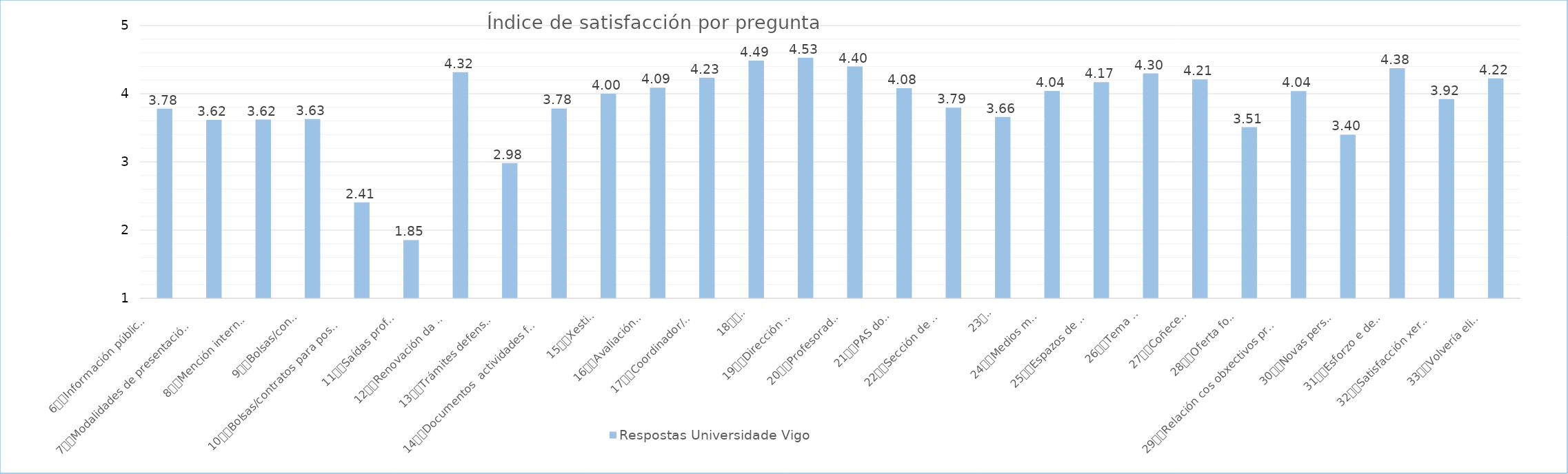
| Category | Respostas Universidade Vigo |
|---|---|
| 6
Información pública DO pd | 3.781 |
| 7
Modalidades de presentación da tese | 3.616 |
| 8
Mención internacional | 3.62 |
| 9
Bolsas/contratos | 3.63 |
| 10
Bolsas/contratos para postdoutorais | 2.405 |
| 11
Saídas profesionais | 1.854 |
| 12
Renovación da matrícula | 4.316 |
| 13
Trámites defensa da tese | 2.982 |
| 14
Documentos  actividades formativas | 3.784 |
| 15
Xestión do PI | 4 |
| 16
Avaliacións anuais | 4.088 |
| 17
Coordinador/a do PD | 4.234 |
| 18
Titor/a | 4.485 |
| 19
Dirección da tese | 4.528 |
| 20
Profesorado do PD | 4.398 |
| 21
PAS do centro | 4.08 |
| 22
Sección de Posgrao | 3.794 |
| 23
EIDO | 3.659 |
| 24
Medios materiais | 4.039 |
| 25
Espazos de traballo | 4.17 |
| 26
Tema da tese | 4.297 |
| 27
Coñecementos | 4.209 |
| 28
Oferta formativa | 3.509 |
| 29
Relación cos obxectivos profesionais | 4.037 |
| 30
Novas perspectivas | 3.4 |
| 31
Esforzo e dedicación | 4.375 |
| 32
Satisfacción xeral co PD | 3.921 |
| 33
Volvería elixir o PD | 4.224 |